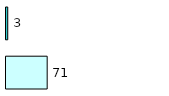
| Category | Series 0 | Series 1 |
|---|---|---|
| 0 | 71 | 3 |